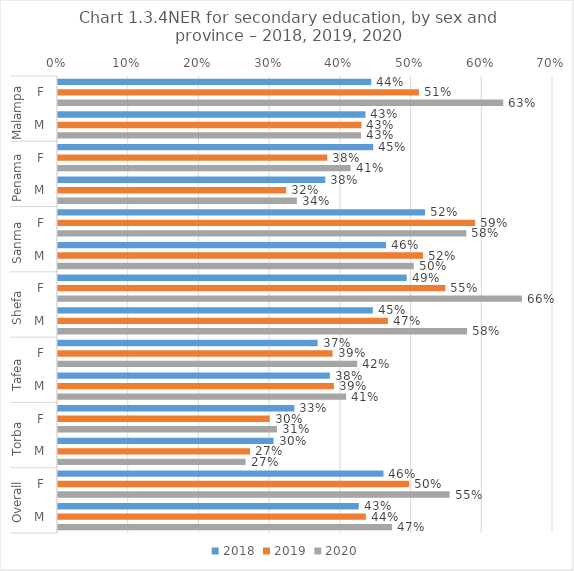
| Category | 2018 | 2019 | 2020 |
|---|---|---|---|
| 0 | 0.443 | 0.51 | 0.63 |
| 1 | 0.435 | 0.429 | 0.428 |
| 2 | 0.446 | 0.381 | 0.414 |
| 3 | 0.378 | 0.323 | 0.338 |
| 4 | 0.519 | 0.59 | 0.577 |
| 5 | 0.464 | 0.516 | 0.503 |
| 6 | 0.493 | 0.548 | 0.656 |
| 7 | 0.445 | 0.467 | 0.579 |
| 8 | 0.367 | 0.388 | 0.423 |
| 9 | 0.384 | 0.39 | 0.408 |
| 10 | 0.334 | 0.299 | 0.31 |
| 11 | 0.305 | 0.272 | 0.265 |
| 12 | 0.46 | 0.497 | 0.554 |
| 13 | 0.425 | 0.435 | 0.472 |